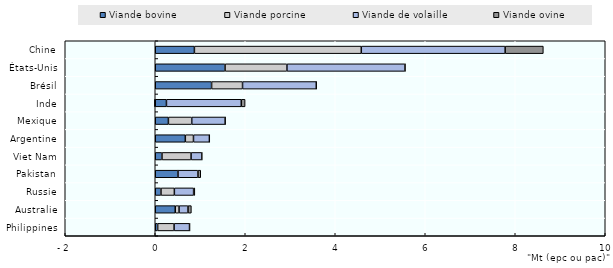
| Category | Viande bovine | Viande porcine | Viande de volaille | Viande ovine |
|---|---|---|---|---|
| Philippines | 0.053 | 0.365 | 0.344 | 0.01 |
| Australie | 0.444 | 0.085 | 0.199 | 0.075 |
| Russie | 0.127 | 0.298 | 0.428 | 0.027 |
| Pakistan | 0.506 | 0 | 0.443 | 0.062 |
| Viet Nam | 0.15 | 0.646 | 0.239 | 0.008 |
| Argentine | 0.668 | 0.181 | 0.354 | 0.005 |
| Mexique | 0.292 | 0.519 | 0.743 | 0.009 |
| Inde | 0.249 | -0.017 | 1.663 | 0.085 |
| Brésil | 1.252 | 0.688 | 1.639 | 0.006 |
| États-Unis | 1.551 | 1.375 | 2.624 | 0.011 |
| Chine | 0.87 | 3.709 | 3.197 | 0.848 |